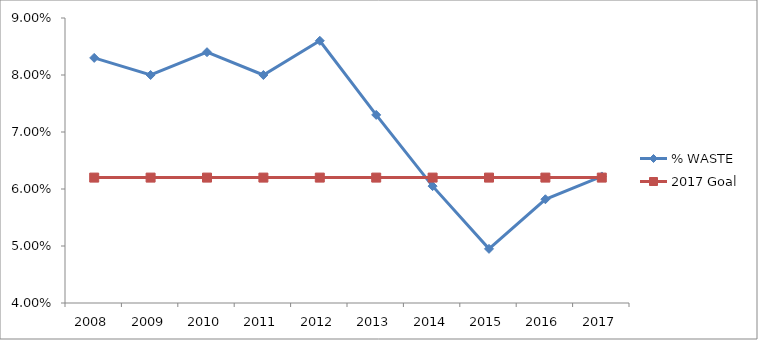
| Category | % WASTE | 2017 Goal |
|---|---|---|
| 2008.0 | 0.083 | 0.062 |
| 2009.0 | 0.08 | 0.062 |
| 2010.0 | 0.084 | 0.062 |
| 2011.0 | 0.08 | 0.062 |
| 2012.0 | 0.086 | 0.062 |
| 2013.0 | 0.073 | 0.062 |
| 2014.0 | 0.06 | 0.062 |
| 2015.0 | 0.05 | 0.062 |
| 2016.0 | 0.058 | 0.062 |
| 2017.0 | 0.062 | 0.062 |